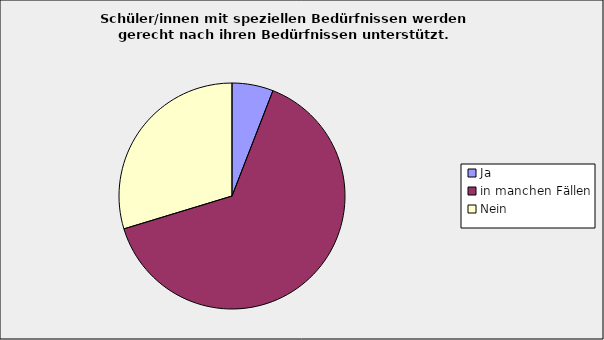
| Category | Series 0 |
|---|---|
| Ja | 0.059 |
| in manchen Fällen | 0.644 |
| Nein | 0.297 |